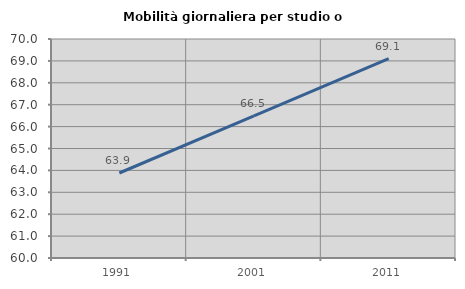
| Category | Mobilità giornaliera per studio o lavoro |
|---|---|
| 1991.0 | 63.881 |
| 2001.0 | 66.484 |
| 2011.0 | 69.109 |